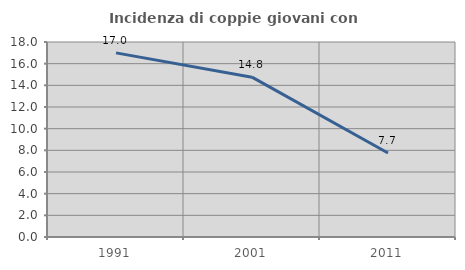
| Category | Incidenza di coppie giovani con figli |
|---|---|
| 1991.0 | 16.995 |
| 2001.0 | 14.754 |
| 2011.0 | 7.748 |